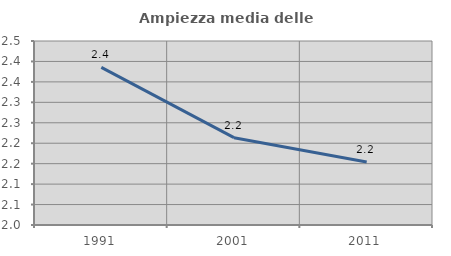
| Category | Ampiezza media delle famiglie |
|---|---|
| 1991.0 | 2.385 |
| 2001.0 | 2.214 |
| 2011.0 | 2.154 |